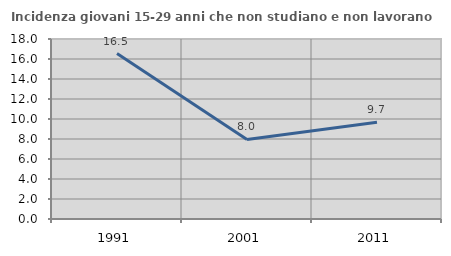
| Category | Incidenza giovani 15-29 anni che non studiano e non lavorano  |
|---|---|
| 1991.0 | 16.549 |
| 2001.0 | 7.96 |
| 2011.0 | 9.669 |